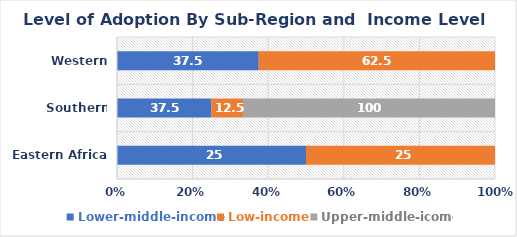
| Category | Lower-middle-income | Low-income | Upper-middle-icome |
|---|---|---|---|
| Eastern Africa | 25 | 25 | 0 |
| Southern Africa | 37.5 | 12.5 | 100 |
| Western Africa | 37.5 | 62.5 | 0 |